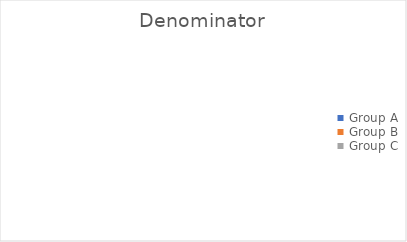
| Category |  Denominator  |
|---|---|
| Group A | 0 |
| Group B | 0 |
| Group C | 0 |